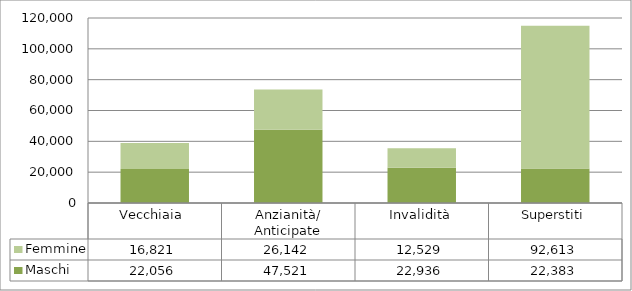
| Category | Maschi | Femmine |
|---|---|---|
| Vecchiaia  | 22056 | 16821 |
| Anzianità/ Anticipate | 47521 | 26142 |
| Invalidità | 22936 | 12529 |
| Superstiti | 22383 | 92613 |